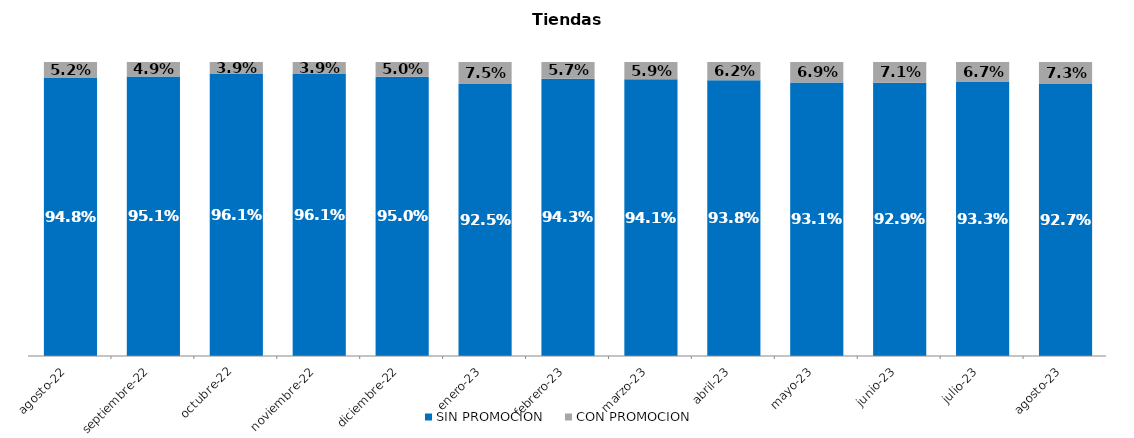
| Category | SIN PROMOCION   | CON PROMOCION   |
|---|---|---|
| 2022-08-01 | 0.948 | 0.052 |
| 2022-09-01 | 0.951 | 0.049 |
| 2022-10-01 | 0.961 | 0.039 |
| 2022-11-01 | 0.961 | 0.039 |
| 2022-12-01 | 0.95 | 0.05 |
| 2023-01-01 | 0.925 | 0.075 |
| 2023-02-01 | 0.943 | 0.057 |
| 2023-03-01 | 0.941 | 0.059 |
| 2023-04-01 | 0.938 | 0.062 |
| 2023-05-01 | 0.931 | 0.069 |
| 2023-06-01 | 0.929 | 0.071 |
| 2023-07-01 | 0.933 | 0.067 |
| 2023-08-01 | 0.927 | 0.073 |